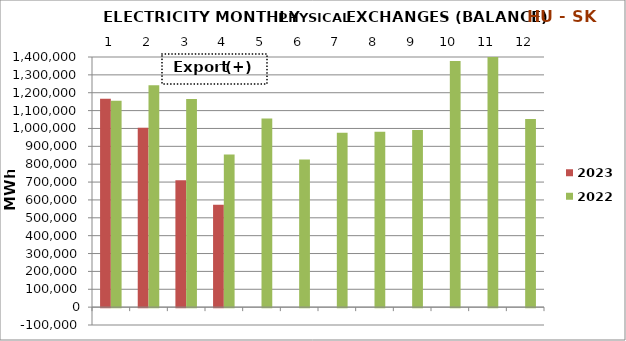
| Category | 2023 | 2022 |
|---|---|---|
| 0 | 1166585.06 | 1154593.08 |
| 1 | 1004039.276 | 1241919.946 |
| 2 | 710374.65 | 1165323.234 |
| 3 | 572949.227 | 854022.263 |
| 4 | 0 | 1055166.712 |
| 5 | 0 | 826082.203 |
| 6 | 0 | 976087.861 |
| 7 | 0 | 981687.692 |
| 8 | 0 | 991996.086 |
| 9 | 0 | 1378302.754 |
| 10 | 0 | 1405605.898 |
| 11 | 0 | 1052537.086 |